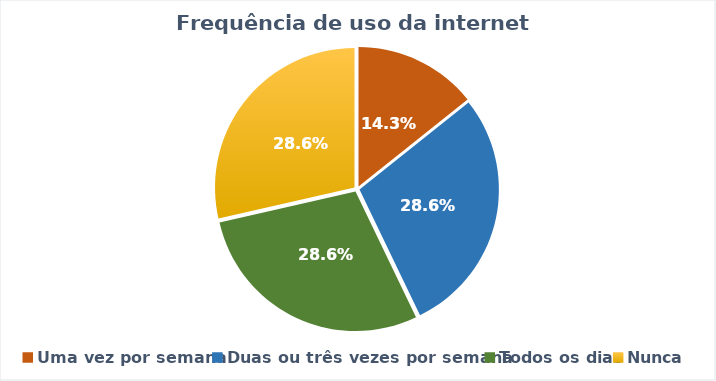
| Category | Series 0 |
|---|---|
| Uma vez por semana | 2 |
| Duas ou três vezes por semana | 4 |
| Todos os dias | 4 |
| Nunca | 4 |